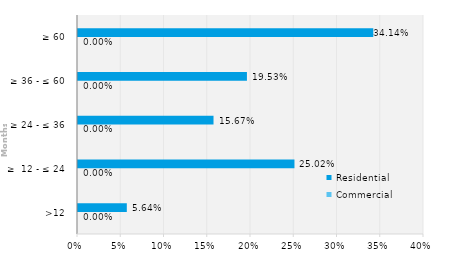
| Category | Commercial | Residential |
|---|---|---|
| >12 | 0 | 0.056 |
| ≥  12 - ≤ 24 | 0 | 0.25 |
| ≥ 24 - ≤ 36 | 0 | 0.157 |
| ≥ 36 - ≤ 60 | 0 | 0.195 |
| ≥ 60 | 0 | 0.341 |